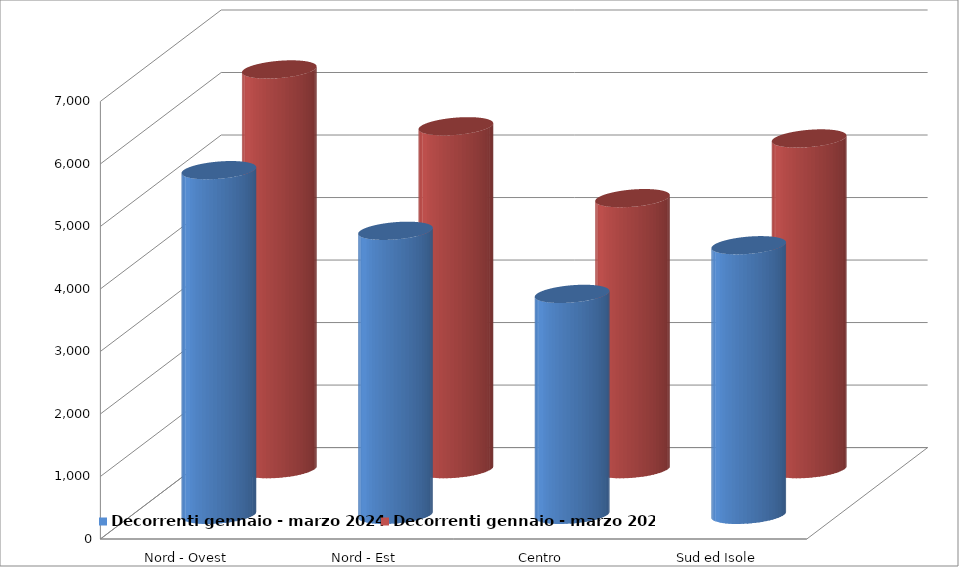
| Category | Decorrenti gennaio - marzo 2024 | Decorrenti gennaio - marzo 2023 |
|---|---|---|
| Nord - Ovest | 5514 | 6394 |
| Nord - Est | 4544 | 5485 |
| Centro | 3535 | 4335 |
| Sud ed Isole | 4313 | 5290 |